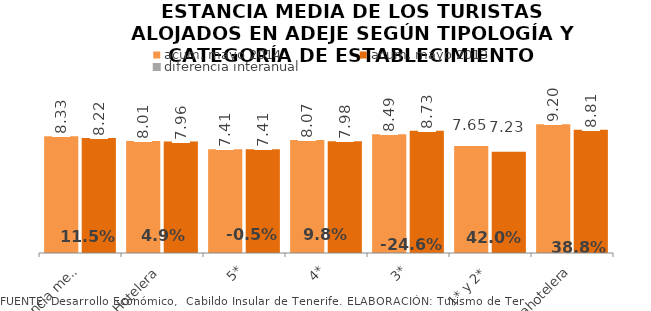
| Category | acum. mayo 2014 | acum. mayo 2013 |
|---|---|---|
| Estancia media total | 8.333 | 8.217 |
| Hotelera | 8.007 | 7.958 |
| 5* | 7.407 | 7.411 |
| 4* | 8.074 | 7.976 |
| 3* | 8.486 | 8.733 |
| 1* y 2* | 7.646 | 7.226 |
| Extrahotelera | 9.197 | 8.809 |